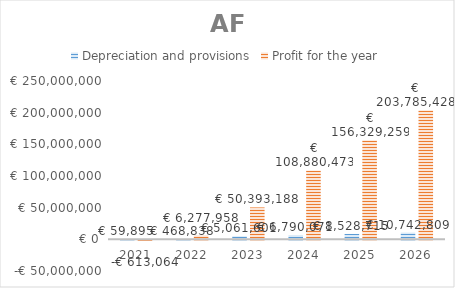
| Category | Depreciation and provisions | Profit for the year |
|---|---|---|
| 2021.0 | 59895.437 | -613063.639 |
| 2022.0 | 468837.533 | 6277957.693 |
| 2023.0 | 5061601.32 | 50393188.195 |
| 2024.0 | 6790070.9 | 108880472.625 |
| 2025.0 | 8528714.74 | 156329258.76 |
| 2026.0 | 10742809.28 | 203785427.768 |